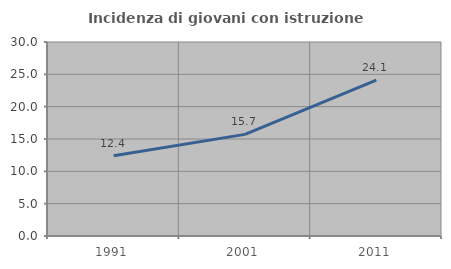
| Category | Incidenza di giovani con istruzione universitaria |
|---|---|
| 1991.0 | 12.399 |
| 2001.0 | 15.718 |
| 2011.0 | 24.121 |